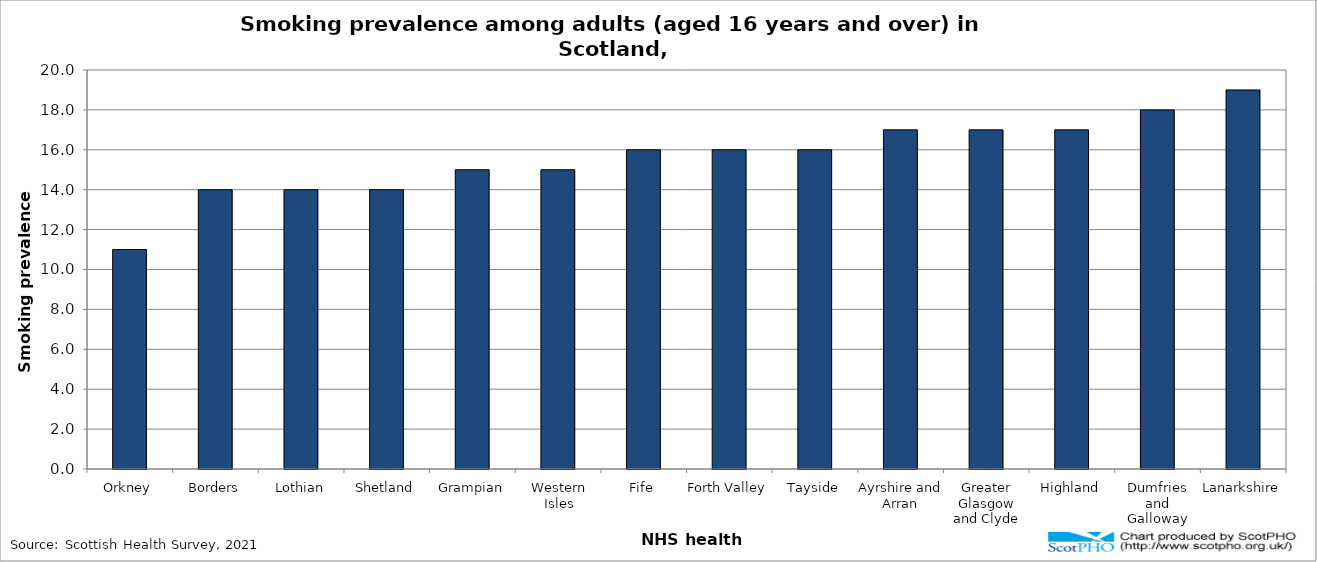
| Category | % |
|---|---|
| Orkney | 11 |
| Borders | 14 |
| Lothian | 14 |
| Shetland | 14 |
| Grampian | 15 |
| Western Isles | 15 |
| Fife | 16 |
| Forth Valley | 16 |
| Tayside | 16 |
| Ayrshire and Arran | 17 |
| Greater Glasgow and Clyde | 17 |
| Highland | 17 |
| Dumfries and Galloway | 18 |
| Lanarkshire | 19 |